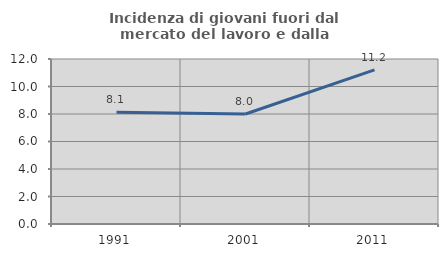
| Category | Incidenza di giovani fuori dal mercato del lavoro e dalla formazione  |
|---|---|
| 1991.0 | 8.131 |
| 2001.0 | 8 |
| 2011.0 | 11.213 |